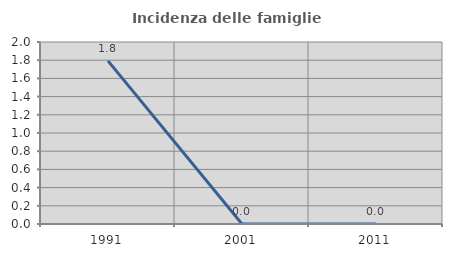
| Category | Incidenza delle famiglie numerose |
|---|---|
| 1991.0 | 1.792 |
| 2001.0 | 0 |
| 2011.0 | 0 |